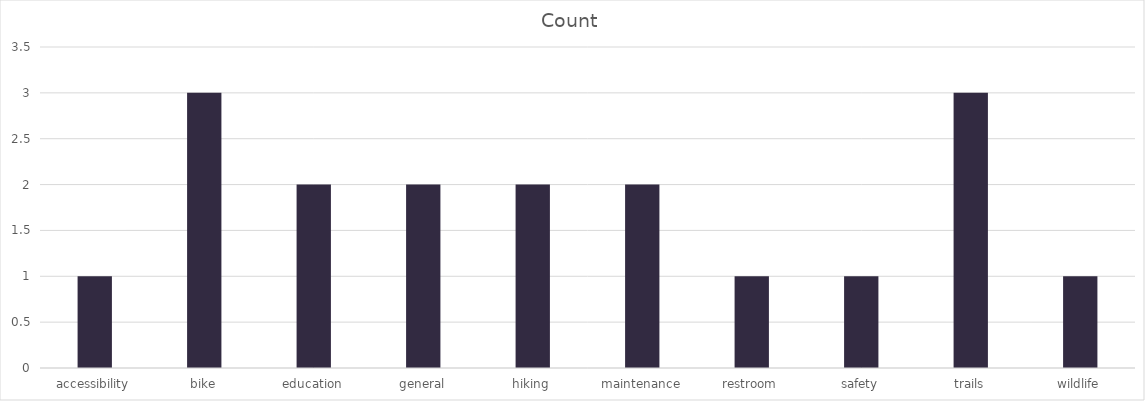
| Category | Count |
|---|---|
| accessibility | 1 |
| bike | 3 |
| education | 2 |
| general | 2 |
| hiking | 2 |
| maintenance | 2 |
| restroom | 1 |
| safety | 1 |
| trails | 3 |
| wildlife | 1 |